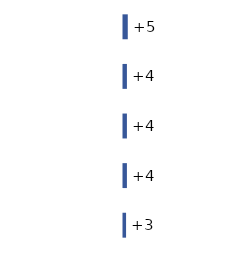
| Category | Series 0 |
|---|---|
| 0 | 5 |
| 1 | 4 |
| 2 | 4 |
| 3 | 4 |
| 4 | 3 |